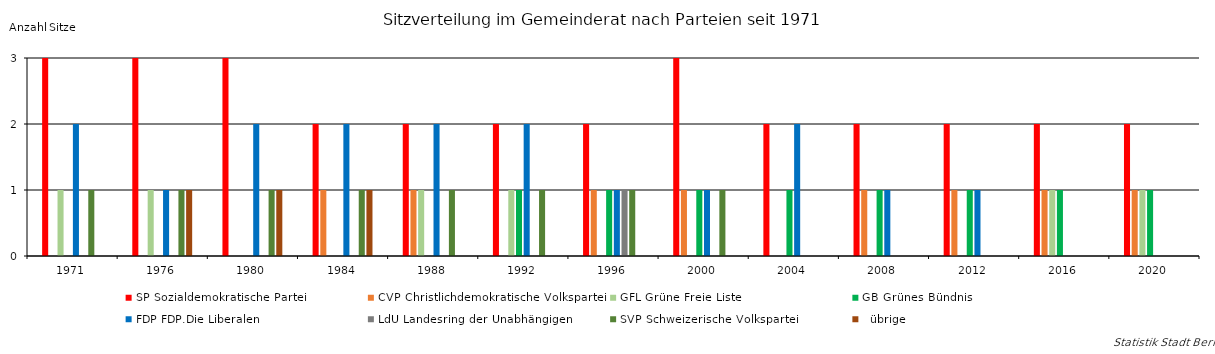
| Category | SP | CVP | GFL | GB | FDP | LdU | SVP |   |
|---|---|---|---|---|---|---|---|---|
| 1971.0 | 3 | 0 | 1 | 0 | 2 | 0 | 1 | 0 |
| 1976.0 | 3 | 0 | 1 | 0 | 1 | 0 | 1 | 1 |
| 1980.0 | 3 | 0 | 0 | 0 | 2 | 0 | 1 | 1 |
| 1984.0 | 2 | 1 | 0 | 0 | 2 | 0 | 1 | 1 |
| 1988.0 | 2 | 1 | 1 | 0 | 2 | 0 | 1 | 0 |
| 1992.0 | 2 | 0 | 1 | 1 | 2 | 0 | 1 | 0 |
| 1996.0 | 2 | 1 | 0 | 1 | 1 | 1 | 1 | 0 |
| 2000.0 | 3 | 1 | 0 | 1 | 1 | 0 | 1 | 0 |
| 2004.0 | 2 | 0 | 0 | 1 | 2 | 0 | 0 | 0 |
| 2008.0 | 2 | 1 | 0 | 1 | 1 | 0 | 0 | 0 |
| 2012.0 | 2 | 1 | 0 | 1 | 1 | 0 | 0 | 0 |
| 2016.0 | 2 | 1 | 1 | 1 | 0 | 0 | 0 | 0 |
| 2020.0 | 2 | 1 | 1 | 1 | 0 | 0 | 0 | 0 |